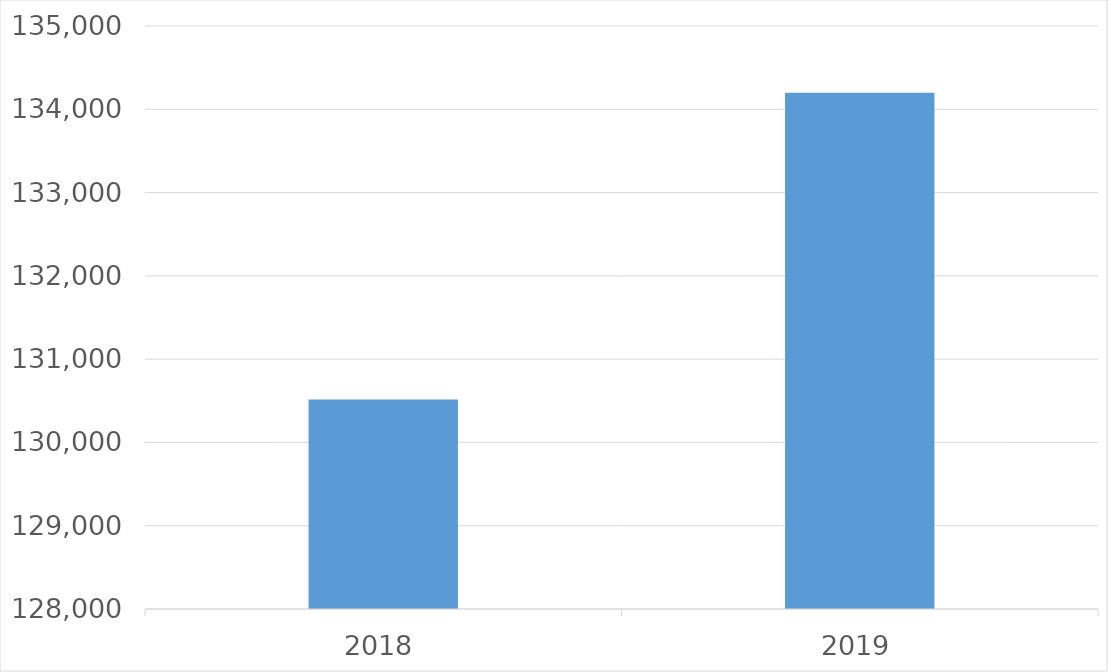
| Category | Series 0 |
|---|---|
| 2018 | 130515 |
| 2019 | 134200 |